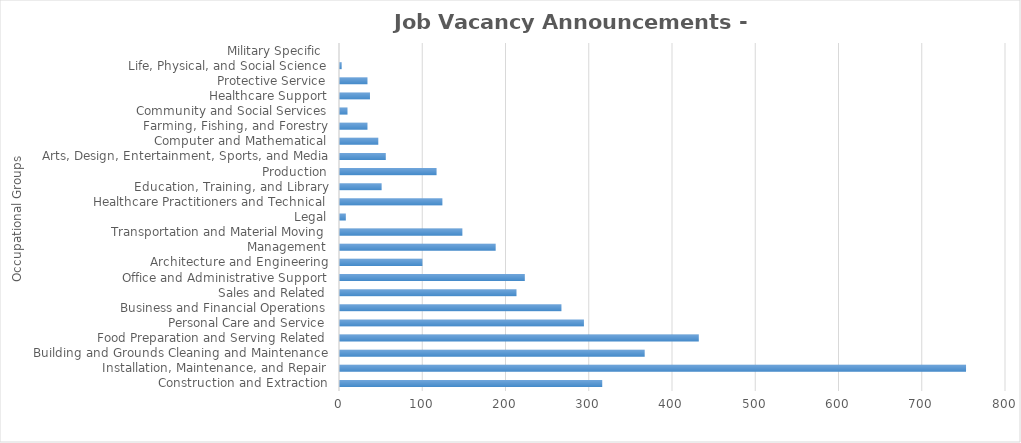
| Category | Total JVAs |
|---|---|
| Construction and Extraction | 315 |
| Installation, Maintenance, and Repair | 752 |
| Building and Grounds Cleaning and Maintenance | 366 |
| Food Preparation and Serving Related | 431 |
| Personal Care and Service | 293 |
| Business and Financial Operations | 266 |
| Sales and Related | 212 |
| Office and Administrative Support | 222 |
| Architecture and Engineering | 99 |
| Management | 187 |
| Transportation and Material Moving | 147 |
| Legal | 7 |
| Healthcare Practitioners and Technical | 123 |
| Education, Training, and Library | 50 |
| Production | 116 |
| Arts, Design, Entertainment, Sports, and Media | 55 |
| Computer and Mathematical | 46 |
| Farming, Fishing, and Forestry | 33 |
| Community and Social Services | 9 |
| Healthcare Support | 36 |
| Protective Service | 33 |
| Life, Physical, and Social Science | 2 |
| Military Specific  | 0 |